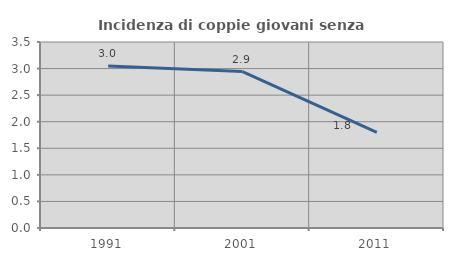
| Category | Incidenza di coppie giovani senza figli |
|---|---|
| 1991.0 | 3.05 |
| 2001.0 | 2.944 |
| 2011.0 | 1.8 |